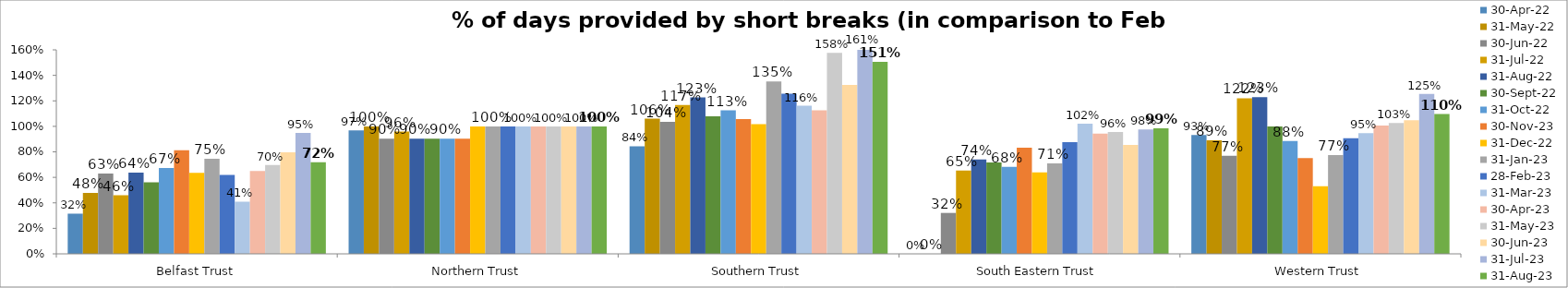
| Category | 30-Apr-22 | 31-May-22 | 30-Jun-22 | 31-Jul-22 | 31-Aug-22 | 30-Sep-22 | 31-Oct-22 | 30-Nov-23 | 31-Dec-22 | 31-Jan-23 | 28-Feb-23 | 31-Mar-23 | 30-Apr-23 | 31-May-23 | 30-Jun-23 | 31-Jul-23 | 31-Aug-23 |
|---|---|---|---|---|---|---|---|---|---|---|---|---|---|---|---|---|---|
| Belfast Trust | 0.315 | 0.479 | 0.63 | 0.46 | 0.637 | 0.562 | 0.673 | 0.813 | 0.635 | 0.746 | 0.618 | 0.41 | 0.649 | 0.697 | 0.796 | 0.948 | 0.718 |
| Northern Trust | 0.968 | 1 | 0.903 | 0.959 | 0.903 | 0.903 | 0.903 | 0.903 | 1 | 1 | 1 | 1 | 1 | 1 | 1 | 1 | 1 |
| Southern Trust | 0.844 | 1.06 | 1.036 | 1.167 | 1.227 | 1.079 | 1.126 | 1.057 | 1.016 | 1.352 | 1.257 | 1.161 | 1.126 | 1.577 | 1.325 | 1.612 | 1.505 |
| South Eastern Trust | 0 | 0 | 0.321 | 0.653 | 0.74 | 0.716 | 0.683 | 0.833 | 0.638 | 0.709 | 0.876 | 1.02 | 0.942 | 0.955 | 0.853 | 0.976 | 0.985 |
| Western Trust | 0.932 | 0.89 | 0.768 | 1.22 | 1.229 | 1 | 0.884 | 0.751 | 0.531 | 0.774 | 0.907 | 0.946 | 1.006 | 1.025 | 1.048 | 1.254 | 1.096 |